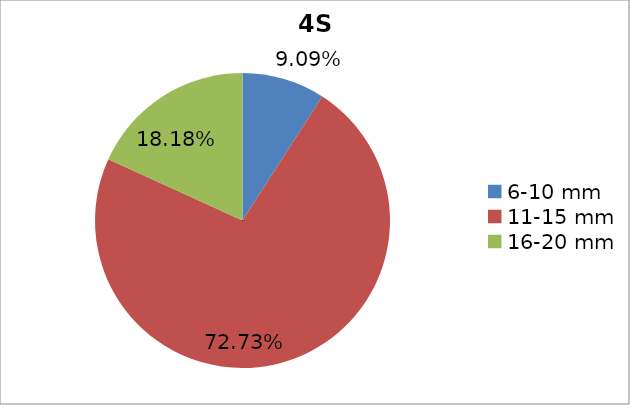
| Category | Series 0 |
|---|---|
| 6-10 mm | 0.091 |
| 11-15 mm | 0.727 |
| 16-20 mm | 0.182 |